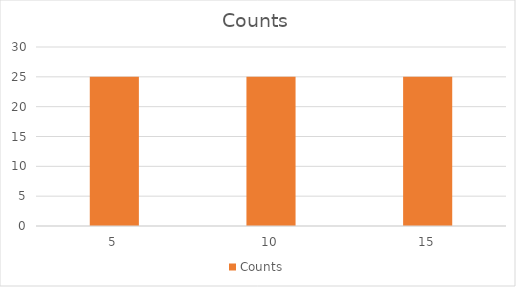
| Category | Counts |
|---|---|
| 5.0 | 25 |
| 10.0 | 25 |
| 15.0 | 25 |